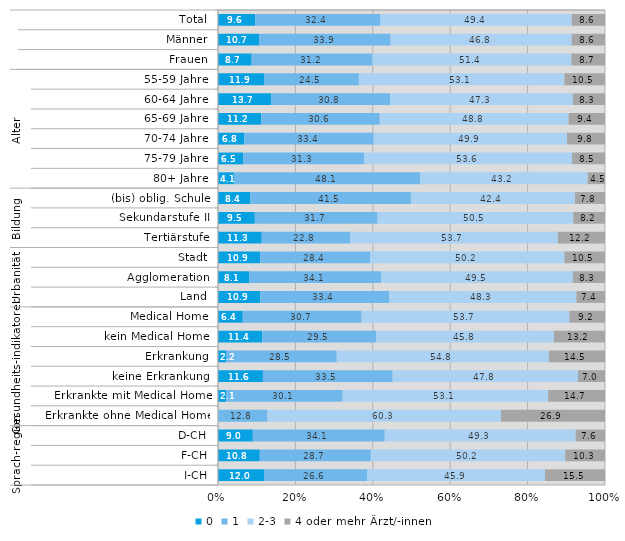
| Category | 0 | 1 | 2-3 | 4 oder mehr Ärzt/-innen |
|---|---|---|---|---|
| 0 | 9.6 | 32.4 | 49.4 | 8.6 |
| 1 | 10.7 | 33.9 | 46.8 | 8.6 |
| 2 | 8.7 | 31.2 | 51.4 | 8.7 |
| 3 | 11.9 | 24.5 | 53.1 | 10.5 |
| 4 | 13.7 | 30.8 | 47.3 | 8.3 |
| 5 | 11.2 | 30.6 | 48.8 | 9.4 |
| 6 | 6.8 | 33.4 | 49.9 | 9.8 |
| 7 | 6.5 | 31.3 | 53.6 | 8.5 |
| 8 | 4.1 | 48.1 | 43.2 | 4.5 |
| 9 | 8.4 | 41.5 | 42.4 | 7.8 |
| 10 | 9.5 | 31.7 | 50.5 | 8.2 |
| 11 | 11.3 | 22.8 | 53.7 | 12.2 |
| 12 | 10.9 | 28.4 | 50.2 | 10.5 |
| 13 | 8.1 | 34.1 | 49.5 | 8.3 |
| 14 | 10.9 | 33.4 | 48.3 | 7.4 |
| 15 | 6.4 | 30.7 | 53.7 | 9.2 |
| 16 | 11.4 | 29.5 | 45.8 | 13.2 |
| 17 | 2.2 | 28.5 | 54.8 | 14.5 |
| 18 | 11.6 | 33.5 | 47.8 | 7 |
| 19 | 2.1 | 30.1 | 53.1 | 14.7 |
| 20 | 0 | 12.8 | 60.3 | 26.9 |
| 21 | 9 | 34.1 | 49.3 | 7.6 |
| 22 | 10.8 | 28.7 | 50.2 | 10.3 |
| 23 | 12 | 26.6 | 45.9 | 15.5 |